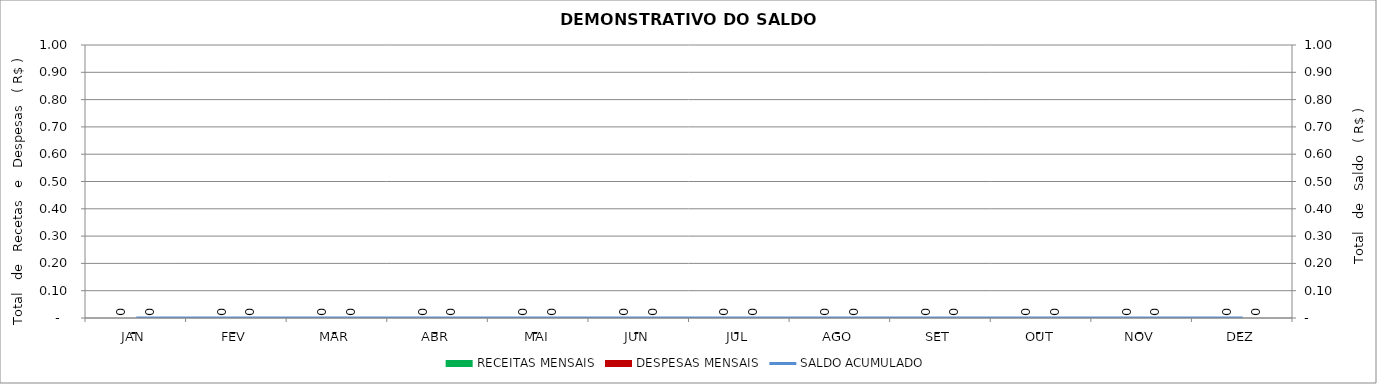
| Category | RECEITAS MENSAIS | DESPESAS MENSAIS |
|---|---|---|
| JAN | 0 | 0 |
| FEV | 0 | 0 |
| MAR | 0 | 0 |
| ABR | 0 | 0 |
| MAI | 0 | 0 |
| JUN | 0 | 0 |
| JUL | 0 | 0 |
| AGO | 0 | 0 |
| SET | 0 | 0 |
| OUT | 0 | 0 |
| NOV | 0 | 0 |
| DEZ | 0 | 0 |